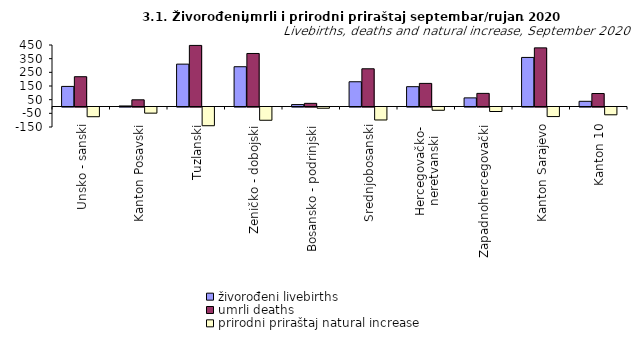
| Category | živorođeni livebirths | umrli deaths | prirodni priraštaj natural increase |
|---|---|---|---|
| Unsko - sanski | 147 | 218 | -71 |
| Kanton Posavski | 4 | 49 | -45 |
| Tuzlanski | 310 | 447 | -137 |
| Zeničko - dobojski | 291 | 388 | -97 |
| Bosansko - podrinjski | 14 | 23 | -9 |
| Srednjobosanski | 181 | 276 | -95 |
| Hercegovačko-
neretvanski | 145 | 169 | -24 |
| Zapadnohercegovački | 63 | 96 | -33 |
| Kanton Sarajevo | 359 | 429 | -70 |
| Kanton 10 | 38 | 95 | -57 |